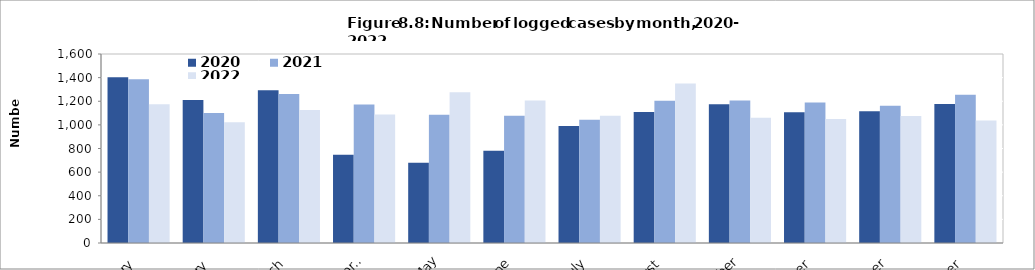
| Category | 2020  | 2021  | 2022  |
|---|---|---|---|
| January | 1403 | 1387 | 1174 |
| February | 1210 | 1100 | 1022 |
| March | 1294 | 1261 | 1126 |
| April | 748 | 1173 | 1088 |
| May | 680 | 1085 | 1277 |
| June | 780 | 1077 | 1206 |
| July | 990 | 1044 | 1077 |
| August | 1109 | 1205 | 1351 |
| September | 1174 | 1206 | 1060 |
| October | 1107 | 1189 | 1050 |
| November | 1116 | 1161 | 1076 |
| December | 1176 | 1255 | 1036 |